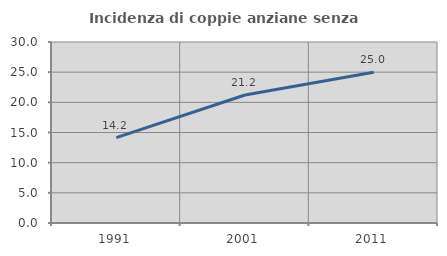
| Category | Incidenza di coppie anziane senza figli  |
|---|---|
| 1991.0 | 14.159 |
| 2001.0 | 21.212 |
| 2011.0 | 25 |